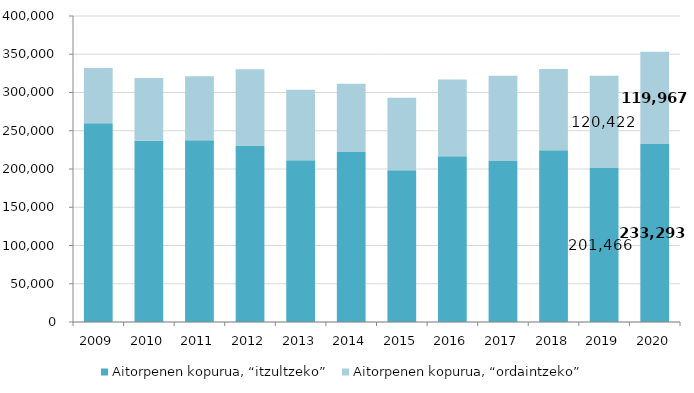
| Category | Aitorpenen kopurua, “itzultzeko” | Aitorpenen kopurua, “ordaintzeko” |
|---|---|---|
| 2009.0 | 259702 | 72208 |
| 2010.0 | 236808 | 82185 |
| 2011.0 | 237625 | 83528 |
| 2012.0 | 230745 | 99745 |
| 2013.0 | 211586 | 91870 |
| 2014.0 | 222131 | 89308 |
| 2015.0 | 198331 | 94958 |
| 2016.0 | 216509 | 100568 |
| 2017.0 | 210528 | 111261 |
| 2018.0 | 224619.366 | 106015.04 |
| 2019.0 | 201466 | 120422 |
| 2020.0 | 233293 | 119967 |